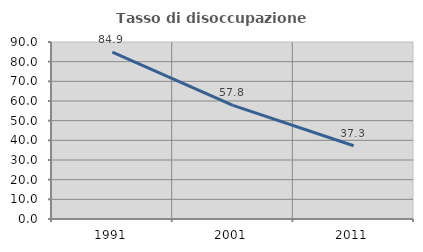
| Category | Tasso di disoccupazione giovanile  |
|---|---|
| 1991.0 | 84.906 |
| 2001.0 | 57.812 |
| 2011.0 | 37.255 |